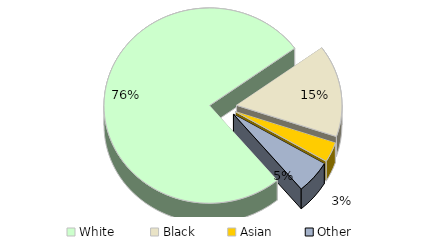
| Category | Series 0 |
|---|---|
| White  | 0.761 |
| Black | 0.152 |
| Asian | 0.033 |
| Other | 0.054 |